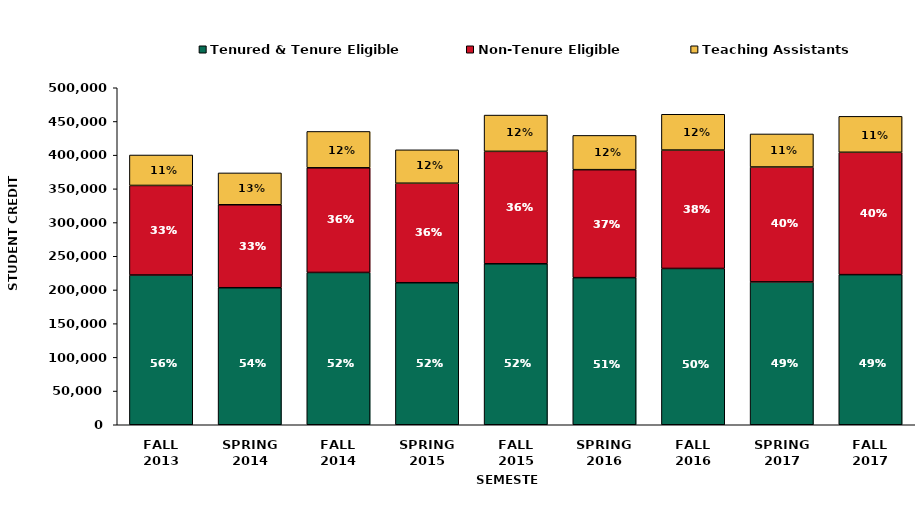
| Category | Tenured & Tenure Eligible | Non-Tenure Eligible | Teaching Assistants |
|---|---|---|---|
| FALL
2013 | 222144 | 132898 | 45190 |
| SPRING
2014 | 203303 | 123085 | 47260 |
| FALL
2014 | 225968 | 155272 | 53948 |
| SPRING
2015 | 210706 | 147660.64 | 49533.43 |
| FALL
2015 | 238831 | 166827.4 | 53818.6 |
| SPRING
2016 | 218266.1 | 160199.7 | 50835.7 |
| FALL
2016 | 231916.8 | 175652.3 | 53107 |
| SPRING
2017 | 211957 | 170476.6 | 49016 |
| FALL
2017 | 222732 | 181530.5 | 53325 |